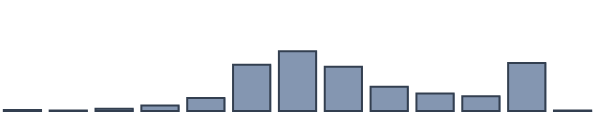
| Category | Series 0 |
|---|---|
| 0 | 0.357 |
| 1 | 0.159 |
| 2 | 0.847 |
| 3 | 1.963 |
| 4 | 4.641 |
| 5 | 16.686 |
| 6 | 21.529 |
| 7 | 15.923 |
| 8 | 8.765 |
| 9 | 6.343 |
| 10 | 5.338 |
| 11 | 17.281 |
| 12 | 0.169 |